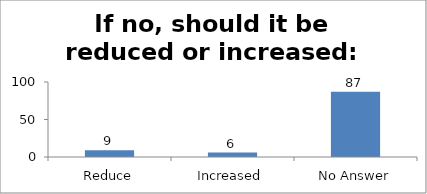
| Category | If no, should it be reduced or increased: |
|---|---|
| Reduce | 9 |
| Increased | 6 |
| No Answer | 87 |